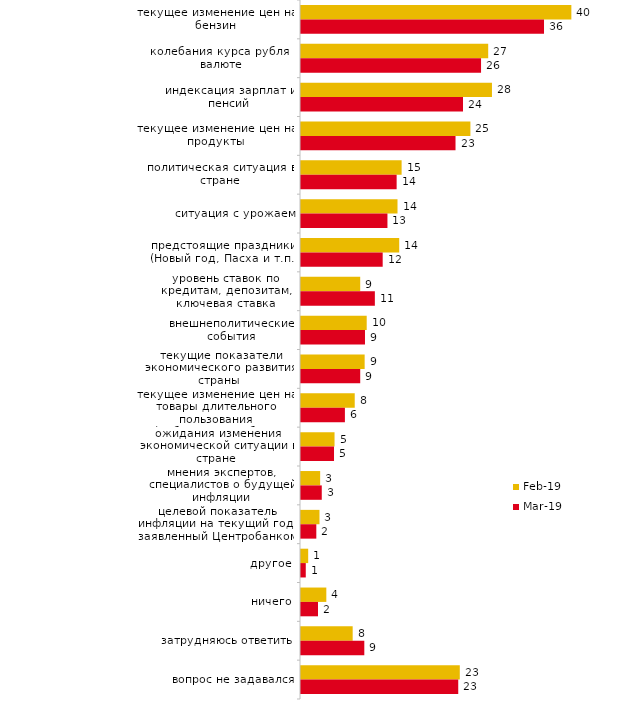
| Category | фев.19 | мар.19 |
|---|---|---|
| текущее изменение цен на бензин | 39.5 | 35.505 |
| колебания курса рубля к валюте | 27.35 | 26.305 |
| индексация зарплат и пенсий | 27.9 | 23.67 |
| текущее изменение цен на продукты | 24.75 | 22.576 |
| политическая ситуация в стране | 14.7 | 13.973 |
| ситуация с урожаем | 14.1 | 12.631 |
| предстоящие праздники (Новый год, Пасха и т.п.) | 14.35 | 11.934 |
| уровень ставок по кредитам, депозитам, ключевая ставка Центрального Банка РФ | 8.65 | 10.791 |
| внешнеполитические события | 9.6 | 9.349 |
| текущие показатели экономического развития страны | 9.3 | 8.652 |
| текущее изменение цен на товары длительного пользования (мебель, автомобиль, бытовая техника и т.п.) | 7.85 | 6.415 |
| ожидания изменения экономической ситуации в стране | 4.9 | 4.823 |
| мнения экспертов, специалистов о будущей инфляции | 2.8 | 3.033 |
| целевой показатель инфляции на текущий год, заявленный Центробанком | 2.7 | 2.238 |
| другое | 1.05 | 0.696 |
| ничего | 3.7 | 2.486 |
| затрудняюсь ответить | 7.55 | 9.249 |
| вопрос не задавался | 23.2 | 22.974 |